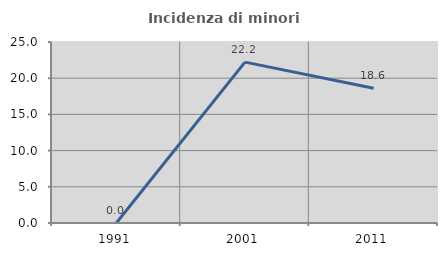
| Category | Incidenza di minori stranieri |
|---|---|
| 1991.0 | 0 |
| 2001.0 | 22.222 |
| 2011.0 | 18.605 |